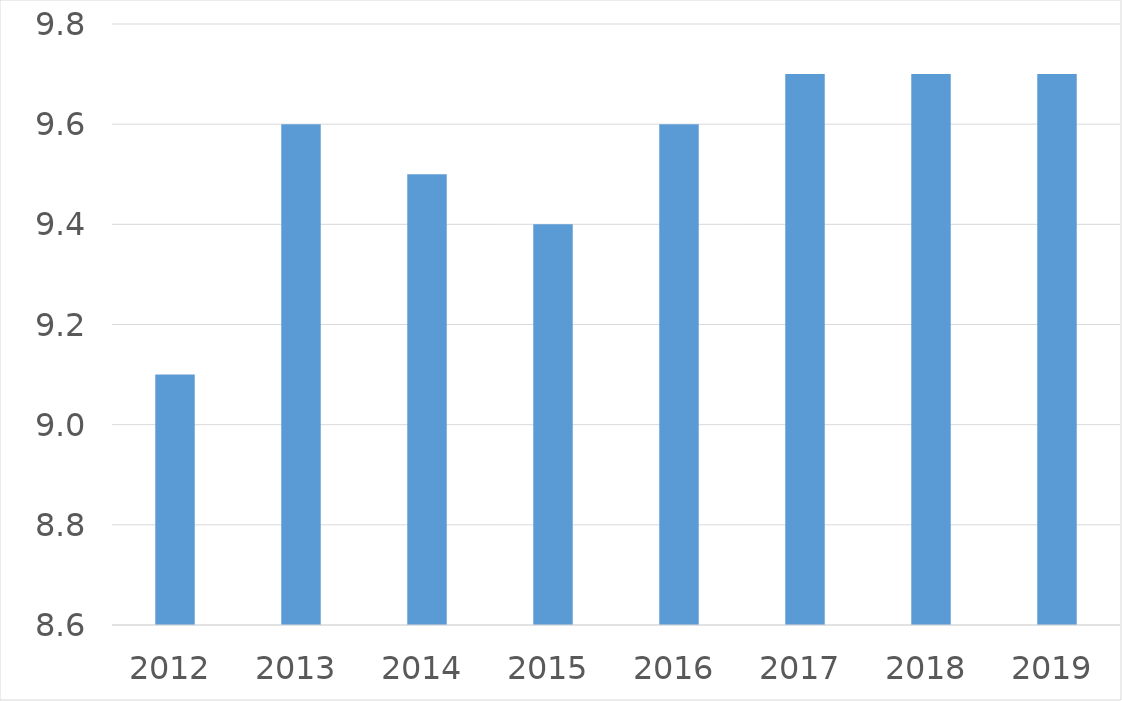
| Category | Series 0 |
|---|---|
| 2012 | 9.1 |
| 2013 | 9.6 |
| 2014 | 9.5 |
| 2015 | 9.4 |
| 2016 | 9.6 |
| 2017 | 9.7 |
| 2018 | 9.7 |
| 2019 | 9.7 |